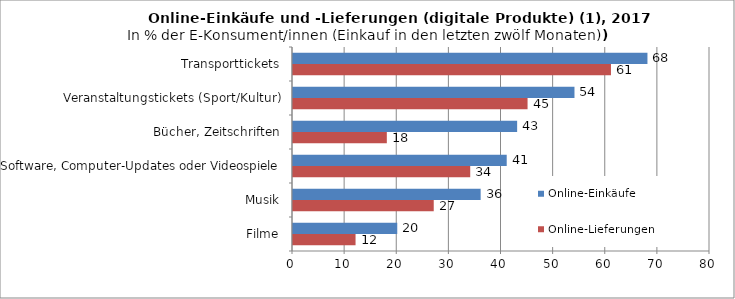
| Category | Online-Lieferungen | Online-Einkäufe |
|---|---|---|
| Filme | 12 | 20 |
| Musik | 27 | 36 |
| Software, Computer-Updates oder Videospiele | 34 | 41 |
| Bücher, Zeitschriften | 18 | 43 |
| Veranstaltungstickets (Sport/Kultur) | 45 | 54 |
| Transporttickets | 61 | 68 |